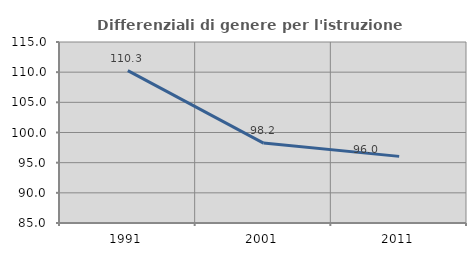
| Category | Differenziali di genere per l'istruzione superiore |
|---|---|
| 1991.0 | 110.266 |
| 2001.0 | 98.241 |
| 2011.0 | 96.044 |